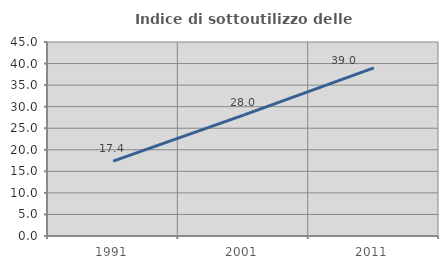
| Category | Indice di sottoutilizzo delle abitazioni  |
|---|---|
| 1991.0 | 17.375 |
| 2001.0 | 28.021 |
| 2011.0 | 38.981 |